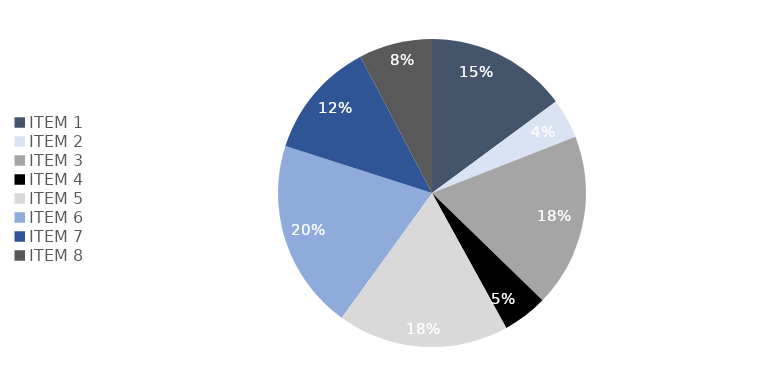
| Category | Series 0 | Series 1 |
|---|---|---|
| ITEM 1 | 0.149 | 0.149 |
| ITEM 2 | 0.042 | 0.042 |
| ITEM 3 | 0.182 | 0.182 |
| ITEM 4 | 0.047 | 0.047 |
| ITEM 5 | 0.18 | 0.18 |
| ITEM 6 | 0.2 | 0.2 |
| ITEM 7 | 0.124 | 0.124 |
| ITEM 8 | 0.077 | 0.077 |